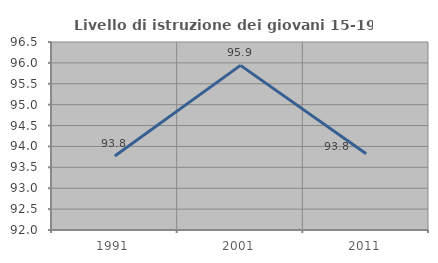
| Category | Livello di istruzione dei giovani 15-19 anni |
|---|---|
| 1991.0 | 93.769 |
| 2001.0 | 95.94 |
| 2011.0 | 93.827 |